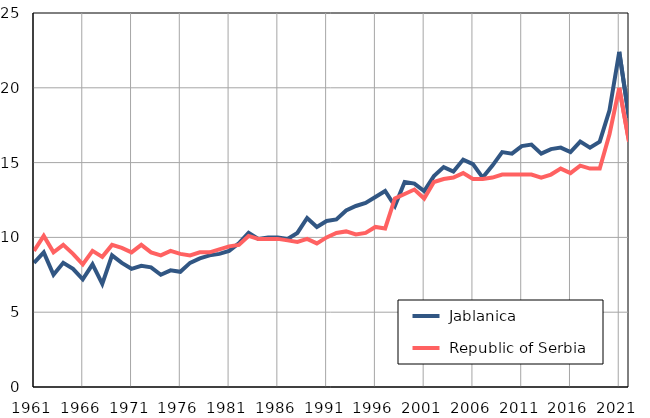
| Category |  Jablanica |  Republic of Serbia |
|---|---|---|
| 1961.0 | 8.3 | 9.1 |
| 1962.0 | 9 | 10.1 |
| 1963.0 | 7.5 | 9 |
| 1964.0 | 8.3 | 9.5 |
| 1965.0 | 7.9 | 8.9 |
| 1966.0 | 7.2 | 8.2 |
| 1967.0 | 8.2 | 9.1 |
| 1968.0 | 6.9 | 8.7 |
| 1969.0 | 8.8 | 9.5 |
| 1970.0 | 8.3 | 9.3 |
| 1971.0 | 7.9 | 9 |
| 1972.0 | 8.1 | 9.5 |
| 1973.0 | 8 | 9 |
| 1974.0 | 7.5 | 8.8 |
| 1975.0 | 7.8 | 9.1 |
| 1976.0 | 7.7 | 8.9 |
| 1977.0 | 8.3 | 8.8 |
| 1978.0 | 8.6 | 9 |
| 1979.0 | 8.8 | 9 |
| 1980.0 | 8.9 | 9.2 |
| 1981.0 | 9.1 | 9.4 |
| 1982.0 | 9.6 | 9.5 |
| 1983.0 | 10.3 | 10.1 |
| 1984.0 | 9.9 | 9.9 |
| 1985.0 | 10 | 9.9 |
| 1986.0 | 10 | 9.9 |
| 1987.0 | 9.9 | 9.8 |
| 1988.0 | 10.3 | 9.7 |
| 1989.0 | 11.3 | 9.9 |
| 1990.0 | 10.7 | 9.6 |
| 1991.0 | 11.1 | 10 |
| 1992.0 | 11.2 | 10.3 |
| 1993.0 | 11.8 | 10.4 |
| 1994.0 | 12.1 | 10.2 |
| 1995.0 | 12.3 | 10.3 |
| 1996.0 | 12.7 | 10.7 |
| 1997.0 | 13.1 | 10.6 |
| 1998.0 | 12.1 | 12.6 |
| 1999.0 | 13.7 | 12.9 |
| 2000.0 | 13.6 | 13.2 |
| 2001.0 | 13.1 | 12.6 |
| 2002.0 | 14.1 | 13.7 |
| 2003.0 | 14.7 | 13.9 |
| 2004.0 | 14.4 | 14 |
| 2005.0 | 15.2 | 14.3 |
| 2006.0 | 14.9 | 13.9 |
| 2007.0 | 14 | 13.9 |
| 2008.0 | 14.8 | 14 |
| 2009.0 | 15.7 | 14.2 |
| 2010.0 | 15.6 | 14.2 |
| 2011.0 | 16.1 | 14.2 |
| 2012.0 | 16.2 | 14.2 |
| 2013.0 | 15.6 | 14 |
| 2014.0 | 15.9 | 14.2 |
| 2015.0 | 16 | 14.6 |
| 2016.0 | 15.7 | 14.3 |
| 2017.0 | 16.4 | 14.8 |
| 2018.0 | 16 | 14.6 |
| 2019.0 | 16.4 | 14.6 |
| 2020.0 | 18.5 | 16.9 |
| 2021.0 | 22.4 | 20 |
| 2022.0 | 18 | 16.4 |